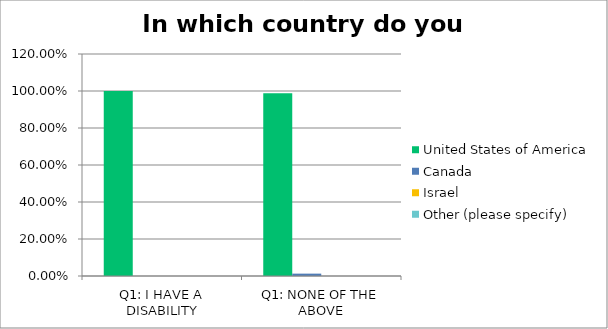
| Category | United States of America | Canada | Israel | Other (please specify) |
|---|---|---|---|---|
| Q1: I HAVE A DISABILITY | 1 | 0 | 0 | 0 |
| Q1: NONE OF THE ABOVE | 0.987 | 0.013 | 0 | 0 |